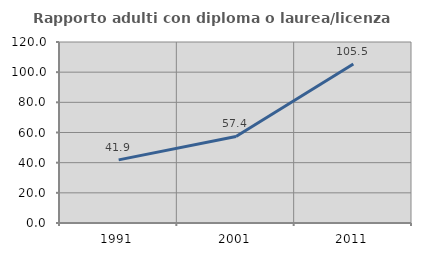
| Category | Rapporto adulti con diploma o laurea/licenza media  |
|---|---|
| 1991.0 | 41.86 |
| 2001.0 | 57.377 |
| 2011.0 | 105.455 |